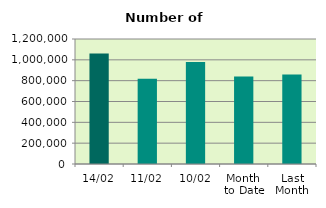
| Category | Series 0 |
|---|---|
| 14/02 | 1060458 |
| 11/02 | 819260 |
| 10/02 | 979962 |
| Month 
to Date | 840112.8 |
| Last
Month | 859790.952 |